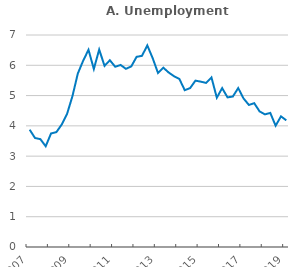
| Category | Series 0 |
|---|---|
| 2007 | 3.874 |
| 2007Q2 | 3.598 |
| 2007Q3 | 3.562 |
| 2007Q4 | 3.326 |
| 2008 | 3.749 |
| 2008Q2 | 3.794 |
| 2008Q3 | 4.046 |
| 2008Q4 | 4.399 |
| 2009 | 4.98 |
| 2009Q2 | 5.726 |
| 2009Q3 | 6.148 |
| 2009Q4 | 6.512 |
| 2010 | 5.877 |
| 2010Q2 | 6.519 |
| 2010Q3 | 5.982 |
| 2010Q4 | 6.166 |
| 2011 | 5.951 |
| 2011Q2 | 6.011 |
| 2011Q3 | 5.882 |
| 2011Q4 | 5.963 |
| 2012 | 6.279 |
| 2012Q2 | 6.311 |
| 2012Q3 | 6.655 |
| 2012Q4 | 6.237 |
| 2013 | 5.746 |
| 2013Q2 | 5.92 |
| 2013Q3 | 5.761 |
| 2013Q4 | 5.639 |
| 2014 | 5.549 |
| 2014Q2 | 5.178 |
| 2014Q3 | 5.246 |
| 2014Q4 | 5.493 |
| 2015 | 5.46 |
| 2015Q2 | 5.417 |
| 2015Q3 | 5.598 |
| 2015Q4 | 4.93 |
| 2016 | 5.247 |
| 2016Q2 | 4.94 |
| 2016Q3 | 4.969 |
| 2016Q4 | 5.247 |
| 2017 | 4.905 |
| 2017Q2 | 4.69 |
| 2017Q3 | 4.748 |
| 2017Q4 | 4.477 |
| 2018 | 4.38 |
| 2018Q2 | 4.427 |
| 2018Q3 | 4.004 |
| 2018Q4 | 4.313 |
| 2019 | 4.182 |